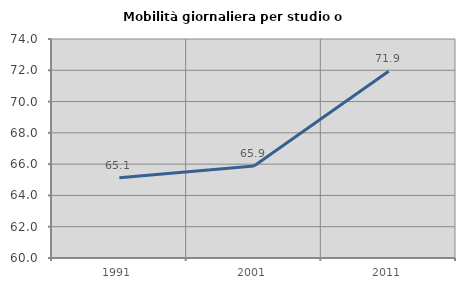
| Category | Mobilità giornaliera per studio o lavoro |
|---|---|
| 1991.0 | 65.13 |
| 2001.0 | 65.875 |
| 2011.0 | 71.945 |